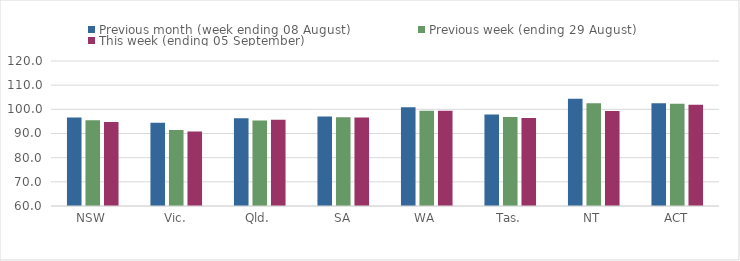
| Category | Previous month (week ending 08 August) | Previous week (ending 29 August) | This week (ending 05 September) |
|---|---|---|---|
| NSW | 96.59 | 95.53 | 94.74 |
| Vic. | 94.5 | 91.48 | 90.86 |
| Qld. | 96.28 | 95.36 | 95.64 |
| SA | 97.04 | 96.77 | 96.67 |
| WA | 100.89 | 99.4 | 99.45 |
| Tas. | 97.86 | 96.87 | 96.42 |
| NT | 104.4 | 102.5 | 99.28 |
| ACT | 102.51 | 102.36 | 101.89 |